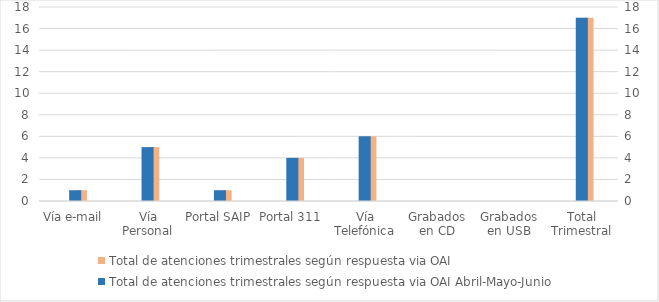
| Category | Total de atenciones trimestrales según respuesta via OAI | Series 2 | Series 4 |
|---|---|---|---|
| Vía e-mail | 1 |  |  |
| Vía Personal | 5 |  |  |
| Portal SAIP | 1 |  |  |
| Portal 311 | 4 |  |  |
| Vía Telefónica | 6 |  |  |
| Grabados en CD | 0 |  |  |
| Grabados en USB | 0 |  |  |
| Total Trimestral | 17 |  |  |